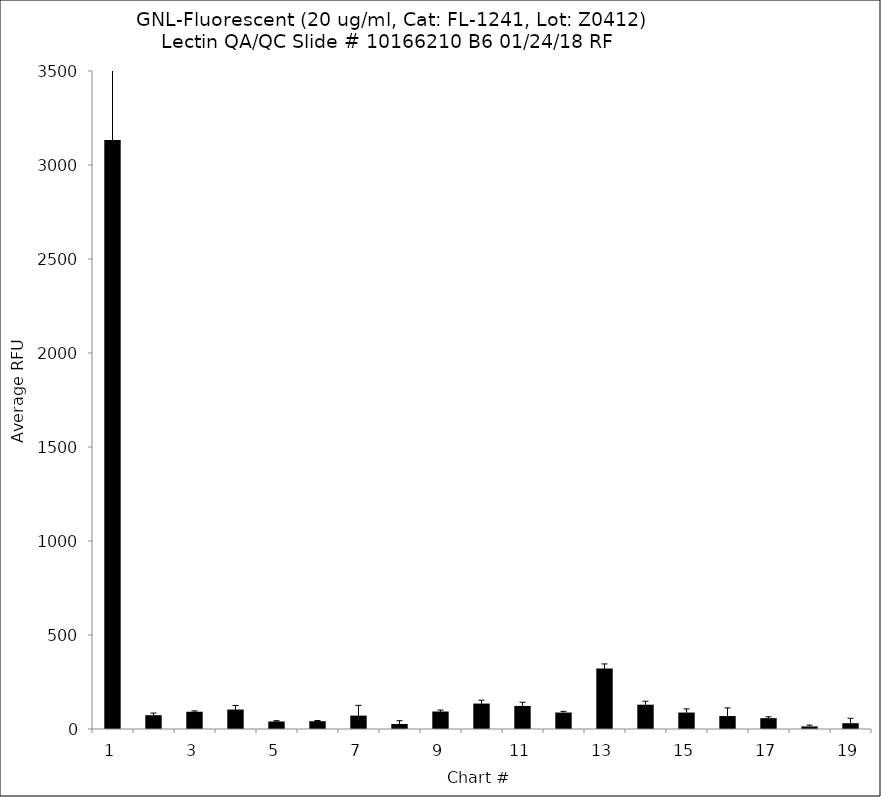
| Category | Series 0 |
|---|---|
| 1.0 | 3132.5 |
| 2.0 | 73.5 |
| 3.0 | 91.75 |
| 4.0 | 103.5 |
| 5.0 | 40 |
| 6.0 | 41.5 |
| 7.0 | 71.25 |
| 8.0 | 26.5 |
| 9.0 | 93 |
| 10.0 | 135.25 |
| 11.0 | 122.75 |
| 12.0 | 87.5 |
| 13.0 | 321.75 |
| 14.0 | 129.25 |
| 15.0 | 87.5 |
| 16.0 | 69 |
| 17.0 | 57.75 |
| 18.0 | 13.75 |
| 19.0 | 30.75 |